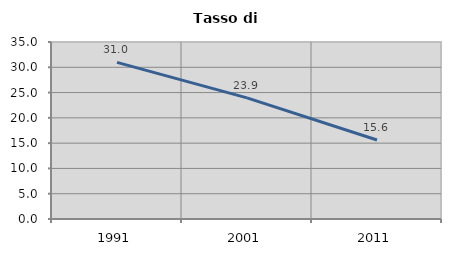
| Category | Tasso di disoccupazione   |
|---|---|
| 1991.0 | 30.979 |
| 2001.0 | 23.946 |
| 2011.0 | 15.628 |